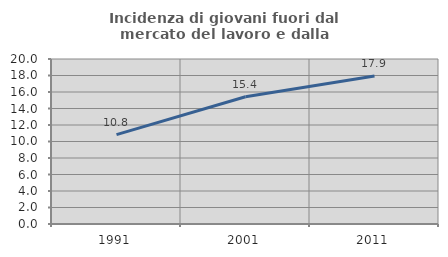
| Category | Incidenza di giovani fuori dal mercato del lavoro e dalla formazione  |
|---|---|
| 1991.0 | 10.837 |
| 2001.0 | 15.426 |
| 2011.0 | 17.949 |